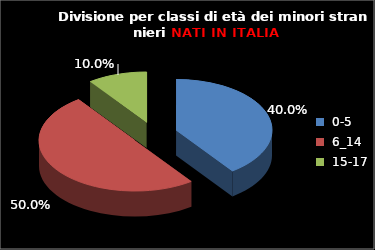
| Category | Series 0 |
|---|---|
| 0-5 | 4 |
| 6_14 | 5 |
| 15-17 | 1 |